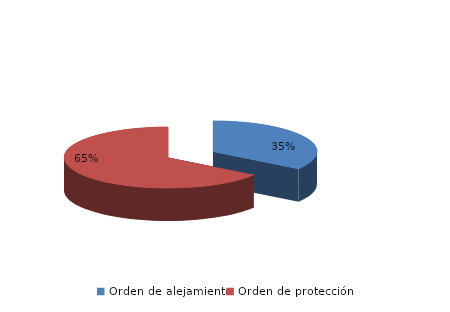
| Category | Series 0 |
|---|---|
| Orden de alejamiento | 412 |
| Orden de protección | 779 |